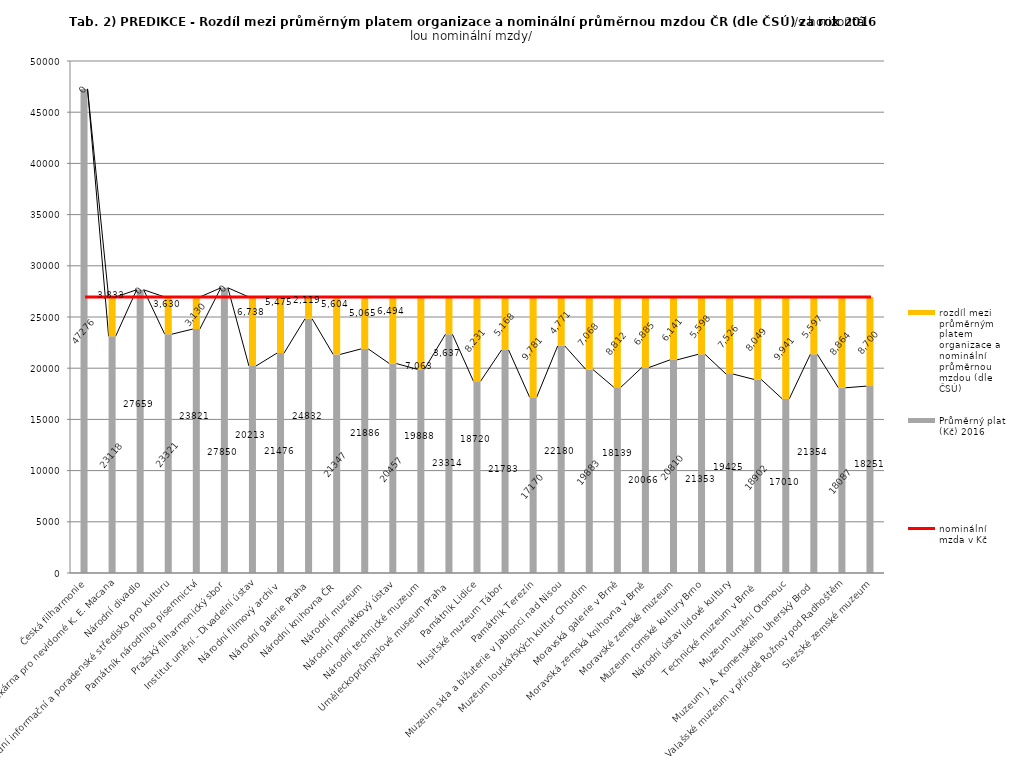
| Category | Průměrný plat (Kč) 2016 | rozdíl mezi průměrným platem organizace a nominální průměrnou mzdou (dle ČSÚ) |
|---|---|---|
| Česká filharmonie | 47276 | 0 |
| Knihovna a tiskárna pro nevidomé K. E. Macana | 23118 | 3833.455 |
| Národní divadlo | 27659 | 0 |
| Národní informační a poradenské středisko pro kulturu | 23321 | 3630.455 |
| Památník národního písemnictví | 23821 | 3130.455 |
| Pražský filharmonický sbor | 27850 | 0 |
| Institut umění - Divadelní ústav | 20213 | 6738.455 |
| Národní filmový archiv | 21476 | 5475.455 |
| Národní galerie Praha | 24832 | 2119.455 |
| Národní knihovna ČR | 21347 | 5604.455 |
| Národní muzeum | 21886 | 5065.455 |
| Národní památkový ústav | 20457 | 6494.455 |
| Národní technické muzeum | 19888 | 7063.455 |
| Uměleckoprůmyslové museum Praha | 23314 | 3637.455 |
| Památník Lidice | 18720 | 8231.455 |
| Husitské muzeum Tábor | 21783 | 5168.455 |
| Památník Terezín | 17170 | 9781.455 |
| Muzeum skla a bižuterie v Jablonci nad Nisou | 22180 | 4771.455 |
| Muzeum loutkářských kultur Chrudim | 19883 | 7068.455 |
| Moravská galerie v Brně | 18139 | 8812.455 |
| Moravská zemská knihovna v Brně | 20066 | 6885.455 |
| Moravské zemské muzeum | 20810 | 6141.455 |
| Muzeum romské kultury Brno | 21353 | 5598.455 |
| Národní ústav lidové kultury | 19425 | 7526.455 |
| Technické muzeum v Brně  | 18902 | 8049.455 |
| Muzeum umění Olomouc | 17010 | 9941.455 |
| Muzeum J. A. Komenského Uherský Brod | 21354 | 5597.455 |
| Valašské muzeum v přírodě Rožnov pod Radhoštěm | 18087 | 8864.455 |
| Slezské zemské muzeum | 18251 | 8700.455 |